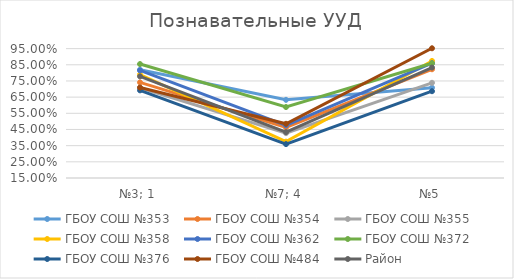
| Category | ГБОУ СОШ №353 | ГБОУ СОШ №354 | ГБОУ СОШ №355 | ГБОУ СОШ №358  | ГБОУ СОШ №362 | ГБОУ СОШ №372 | ГБОУ СОШ №376 | ГБОУ СОШ №484 | Район |
|---|---|---|---|---|---|---|---|---|---|
| №3; 1 | 0.819 | 0.741 | 0.708 | 0.79 | 0.815 | 0.854 | 0.692 | 0.709 | 0.778 |
| №7; 4 | 0.633 | 0.463 | 0.427 | 0.375 | 0.476 | 0.589 | 0.36 | 0.485 | 0.433 |
| №5 | 0.708 | 0.822 | 0.739 | 0.874 | 0.86 | 0.859 | 0.687 | 0.952 | 0.833 |